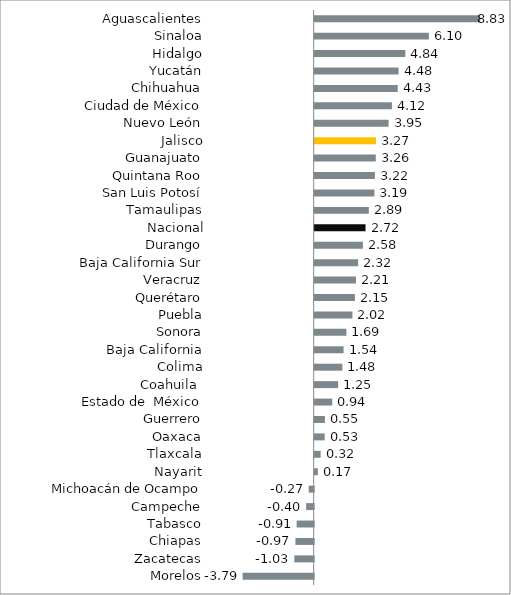
| Category | Series 0 |
|---|---|
|           Morelos | -3.792 |
|           Zacatecas | -1.033 |
|           Chiapas | -0.974 |
|           Tabasco | -0.91 |
|           Campeche | -0.403 |
|           Michoacán de Ocampo | -0.267 |
|           Nayarit | 0.173 |
|           Tlaxcala | 0.319 |
|           Oaxaca | 0.535 |
|           Guerrero | 0.548 |
|          Estado de  México | 0.938 |
|           Coahuila  | 1.255 |
|           Colima | 1.478 |
|           Baja California | 1.544 |
|           Sonora | 1.694 |
|           Puebla | 2.017 |
|           Querétaro | 2.147 |
|           Veracruz | 2.205 |
|           Baja California Sur | 2.32 |
|           Durango | 2.576 |
| Nacional | 2.716 |
|           Tamaulipas | 2.89 |
|           San Luis Potosí | 3.189 |
|           Quintana Roo | 3.216 |
|           Guanajuato | 3.263 |
|           Jalisco | 3.274 |
|           Nuevo León | 3.946 |
|           Ciudad de México | 4.123 |
|           Chihuahua | 4.434 |
|           Yucatán | 4.48 |
|           Hidalgo | 4.842 |
|           Sinaloa | 6.097 |
|           Aguascalientes | 8.834 |